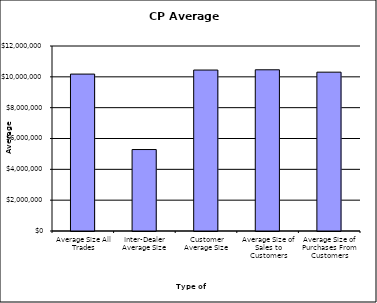
| Category | Security Type |
|---|---|
| Average Size All Trades | 10178619.944 |
| Inter-Dealer Average Size | 5283684.932 |
| Customer Average Size | 10441169.728 |
| Average Size of Sales to Customers | 10457045.045 |
| Average Size of Purchases From Customers | 10302714.286 |